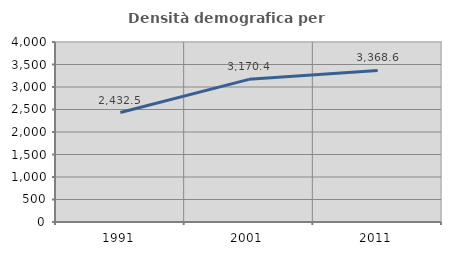
| Category | Densità demografica |
|---|---|
| 1991.0 | 2432.48 |
| 2001.0 | 3170.426 |
| 2011.0 | 3368.563 |